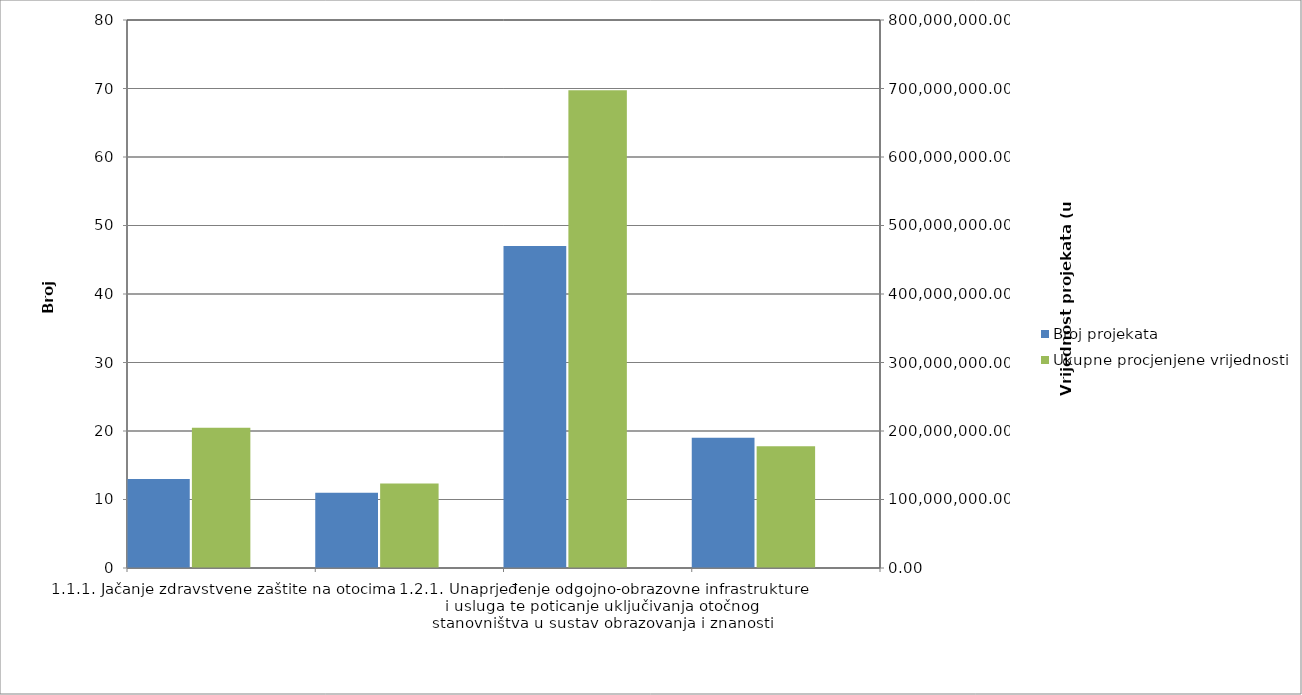
| Category | Broj projekata | Series 1 |
|---|---|---|
| 1.1.1. Jačanje zdravstvene zaštite na otocima | 13 |  |
| 1.1.2. Poboljšanje socijalnih usluga na otocima | 11 |  |
| 1.2.1. Unaprjeđenje odgojno-obrazovne infrastrukture i usluga te poticanje uključivanja otočnog stanovništva u sustav obrazovanja i znanosti | 47 |  |
| 1.2.2. Unaprjeđenje društveno-gospodarskog razvoja otoka kroz programe lokalne zajednice i potpore deficitarnim zanimanjima | 19 |  |